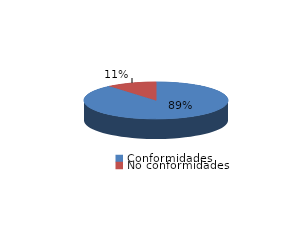
| Category | Series 0 |
|---|---|
| Conformidades | 406 |
| No conformidades | 51 |